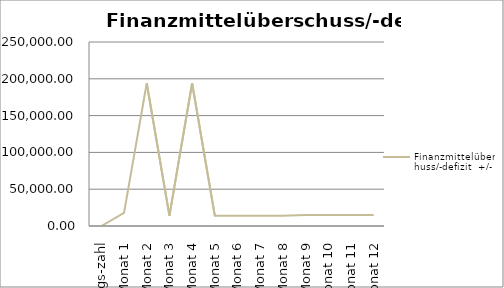
| Category | Finanzmittelüberschuss/-defizit |
|---|---|
| Anfangs-zahl | 0 |
| Monat 1 | 17900 |
| Monat 2 | 193900 |
| Monat 3 | 14000 |
| Monat 4 | 194000 |
| Monat 5 | 14000 |
| Monat 6 | 14000 |
| Monat 7 | 14000 |
| Monat 8 | 14000 |
| Monat 9 | 15000 |
| Monat 10 | 15000 |
| Monat 11 | 15000 |
| Monat 12 | 15000 |